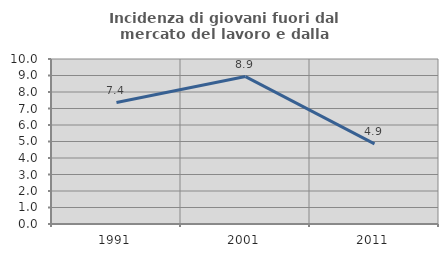
| Category | Incidenza di giovani fuori dal mercato del lavoro e dalla formazione  |
|---|---|
| 1991.0 | 7.359 |
| 2001.0 | 8.936 |
| 2011.0 | 4.858 |